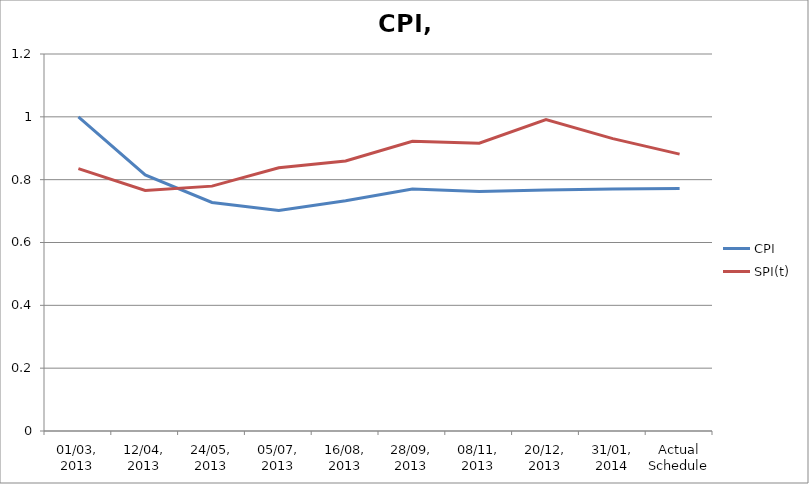
| Category | CPI | SPI(t) |
|---|---|---|
| 01/03, 2013 | 1 | 0.835 |
| 12/04, 2013 | 0.815 | 0.766 |
| 24/05, 2013 | 0.728 | 0.779 |
| 05/07, 2013 | 0.702 | 0.838 |
| 16/08, 2013 | 0.733 | 0.859 |
| 28/09, 2013 | 0.77 | 0.922 |
| 08/11, 2013 | 0.763 | 0.916 |
| 20/12, 2013 | 0.767 | 0.991 |
| 31/01, 2014 | 0.771 | 0.931 |
| Actual Schedule | 0.772 | 0.881 |